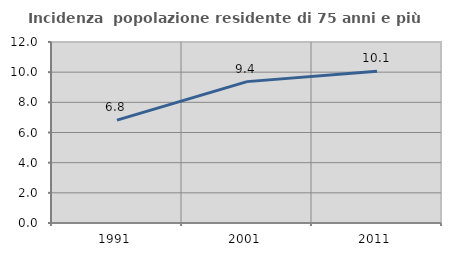
| Category | Incidenza  popolazione residente di 75 anni e più |
|---|---|
| 1991.0 | 6.821 |
| 2001.0 | 9.373 |
| 2011.0 | 10.06 |